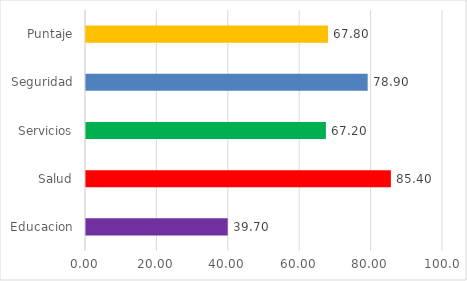
| Category | Series 0 |
|---|---|
| Educacion | 39.7 |
| Salud | 85.4 |
| Servicios | 67.2 |
| Seguridad | 78.9 |
| Puntaje | 67.8 |